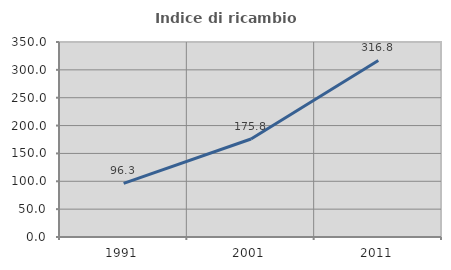
| Category | Indice di ricambio occupazionale  |
|---|---|
| 1991.0 | 96.313 |
| 2001.0 | 175.833 |
| 2011.0 | 316.832 |